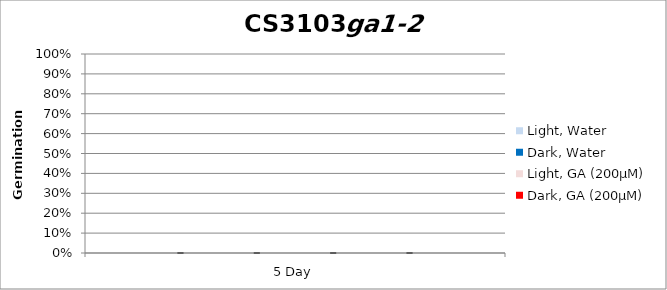
| Category | Light, Water | Dark, Water | Light, GA (200µM) | Dark, GA (200µM) |
|---|---|---|---|---|
| 5 Day | 0 | 0 | 0 | 0 |